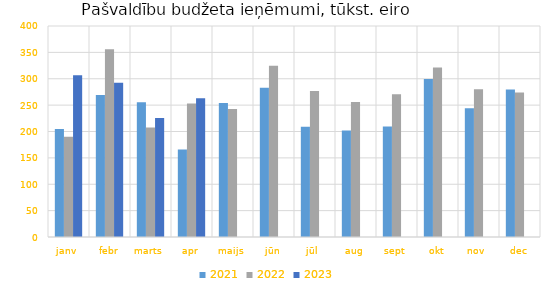
| Category | 2021 | 2022 | 2023 |
|---|---|---|---|
| janv | 204517.329 | 190252.346 | 306465.267 |
| febr | 269110.565 | 356152.105 | 292294.044 |
| marts | 255479.297 | 207474.213 | 225671.949 |
| apr | 166036.194 | 253268.686 | 262816.149 |
| maijs | 253889.01 | 242842.454 | 0 |
| jūn | 283015.617 | 324518.39 | 0 |
| jūl | 209024.05 | 276611.728 | 0 |
| aug | 201829.938 | 255749.732 | 0 |
| sept | 209634.733 | 270436.895 | 0 |
| okt | 299380.785 | 321133.295 | 0 |
| nov | 244254.482 | 280117.67 | 0 |
| dec | 279855.963 | 273764.648 | 0 |